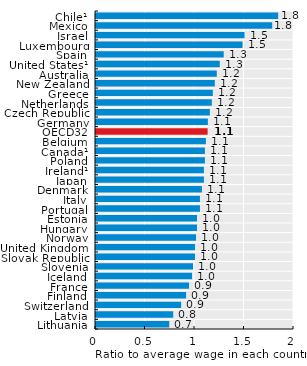
| Category | Series 0 |
|---|---|
| Lithuania | 0.74 |
| Latvia | 0.78 |
| Switzerland | 0.86 |
| Finland | 0.91 |
| France | 0.94 |
| Iceland | 0.97 |
| Slovenia | 0.98 |
| Slovak Republic | 1 |
| United Kingdom | 1 |
| Norway | 1.01 |
| Hungary | 1.02 |
| Estonia | 1.02 |
| Portugal | 1.05 |
| Italy | 1.05 |
| Denmark | 1.07 |
| Japan | 1.09 |
| Ireland¹ | 1.09 |
| Poland | 1.1 |
| Canada¹ | 1.1 |
| Belgium | 1.11 |
| OECD32 | 1.128 |
| Germany | 1.13 |
| Czech Republic | 1.15 |
| Netherlands | 1.17 |
| Greece | 1.18 |
| New Zealand | 1.2 |
| Australia | 1.22 |
| United States¹ | 1.25 |
| Spain | 1.29 |
| Luxembourg | 1.48 |
| Israel | 1.5 |
| Mexico | 1.78 |
| Chile¹ | 1.84 |